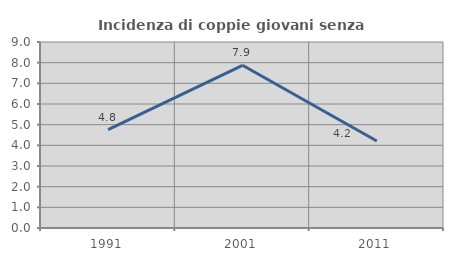
| Category | Incidenza di coppie giovani senza figli |
|---|---|
| 1991.0 | 4.762 |
| 2001.0 | 7.872 |
| 2011.0 | 4.213 |